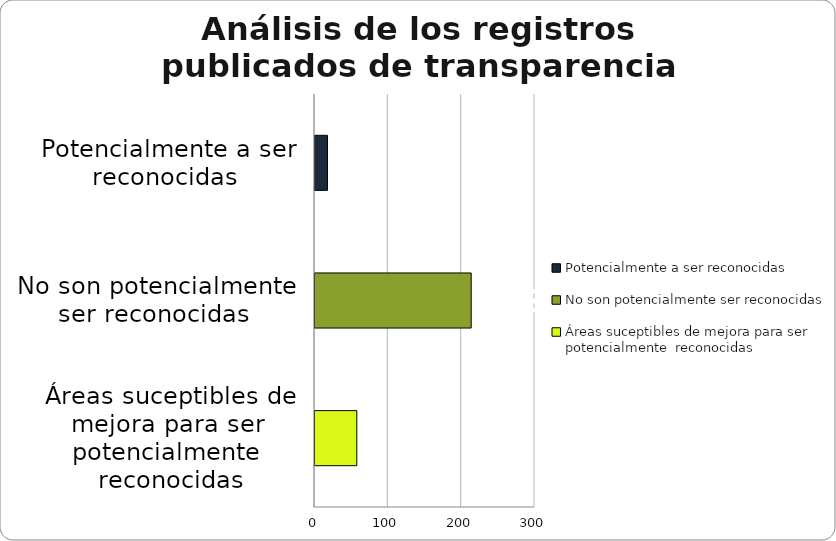
| Category | Series 0 |
|---|---|
| Potencialmente a ser reconocidas  | 17 |
| No son potencialmente ser reconocidas  | 213 |
| Áreas suceptibles de mejora para ser  potencialmente  reconocidas | 57 |